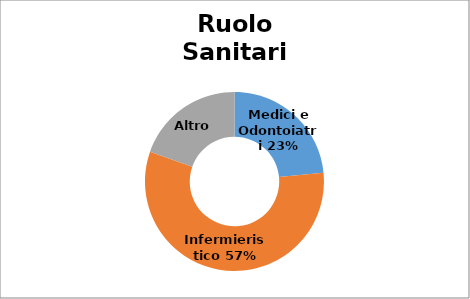
| Category | Series 0 |
|---|---|
| Medici e Odontoiatri | 0.234 |
| Infermieristico | 0.569 |
| Altro  | 0.196 |